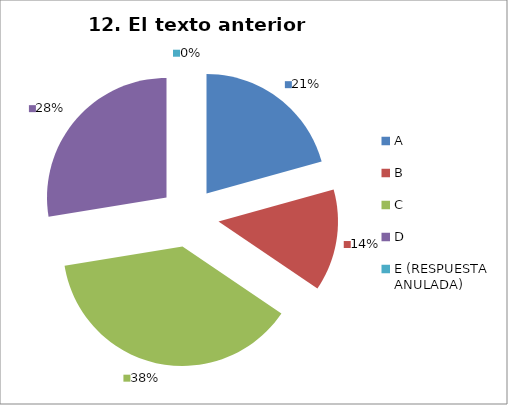
| Category | CANTIDAD DE RESPUESTAS PREGUNTA (12) | PORCENTAJE |
|---|---|---|
| A | 6 | 0.207 |
| B | 4 | 0.138 |
| C | 11 | 0.379 |
| D | 8 | 0.276 |
| E (RESPUESTA ANULADA) | 0 | 0 |